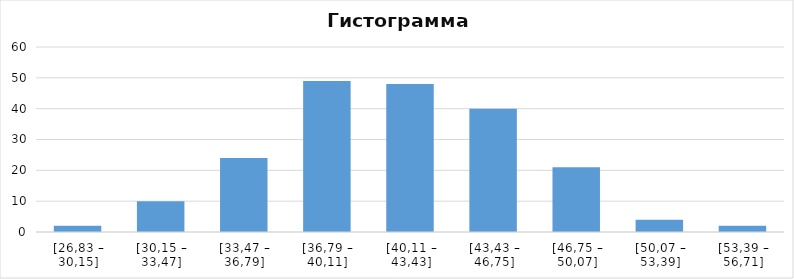
| Category | Series 0 |
|---|---|
| [26,83 – 30,15] | 2 |
| [30,15 – 33,47] | 10 |
| [33,47 – 36,79] | 24 |
| [36,79 – 40,11] | 49 |
| [40,11 – 43,43] | 48 |
| [43,43 – 46,75] | 40 |
| [46,75 – 50,07] | 21 |
| [50,07 – 53,39] | 4 |
| [53,39 – 56,71] | 2 |